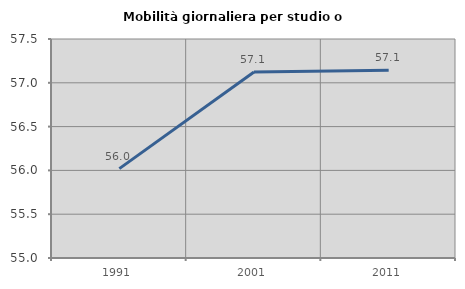
| Category | Mobilità giornaliera per studio o lavoro |
|---|---|
| 1991.0 | 56.02 |
| 2001.0 | 57.122 |
| 2011.0 | 57.143 |